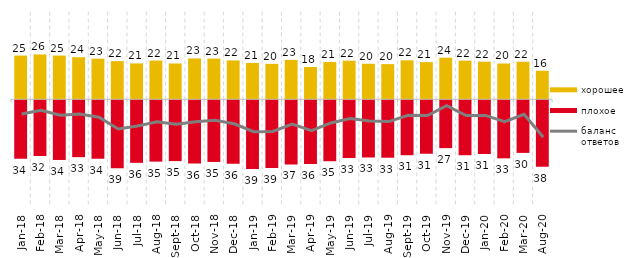
| Category | хорошее | плохое |
|---|---|---|
| 2018-01-01 | 25.05 | -33.5 |
| 2018-02-01 | 25.7 | -31.95 |
| 2018-03-01 | 25.05 | -34.2 |
| 2018-04-01 | 24.1 | -32.6 |
| 2018-05-01 | 23.25 | -33.5 |
| 2018-06-01 | 21.85 | -38.9 |
| 2018-07-01 | 20.55 | -35.85 |
| 2018-08-01 | 22.2 | -35.15 |
| 2018-09-01 | 20.5 | -34.85 |
| 2018-10-01 | 23.4 | -36.25 |
| 2018-11-01 | 23.303 | -35.329 |
| 2018-12-01 | 22.25 | -36.3 |
| 2019-01-01 | 20.8 | -39.35 |
| 2019-02-01 | 20.3 | -38.75 |
| 2019-03-01 | 22.576 | -36.748 |
| 2019-04-01 | 18.465 | -36.485 |
| 2019-05-01 | 21.347 | -34.918 |
| 2019-06-01 | 22.095 | -33.067 |
| 2019-07-01 | 20.347 | -32.772 |
| 2019-08-01 | 20.13 | -32.917 |
| 2019-09-01 | 22.327 | -31.485 |
| 2019-10-01 | 21.287 | -30.644 |
| 2019-11-01 | 23.812 | -27.426 |
| 2019-12-01 | 22.129 | -31.485 |
| 2020-01-01 | 21.535 | -30.792 |
| 2020-02-01 | 20.495 | -33.267 |
| 2020-03-01 | 21.517 | -30.144 |
| 2020-08-01 | 16.336 | -38.083 |